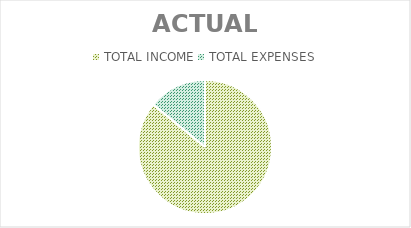
| Category | Series 0 |
|---|---|
| TOTAL INCOME | 1831 |
| TOTAL EXPENSES | 300 |